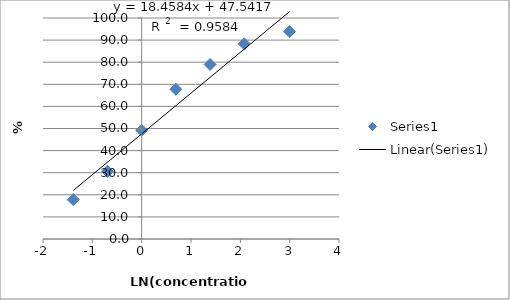
| Category | Series 0 |
|---|---|
| 2.995732273553991 | 93.854 |
| 2.079441541679836 | 88.338 |
| 1.386294361119891 | 78.971 |
| 0.693147180559945 | 67.753 |
| 0.0 | 49.204 |
| -0.693147180559945 | 30.544 |
| -1.386294361119891 | 17.808 |